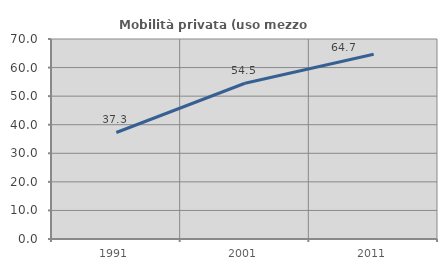
| Category | Mobilità privata (uso mezzo privato) |
|---|---|
| 1991.0 | 37.278 |
| 2001.0 | 54.511 |
| 2011.0 | 64.672 |